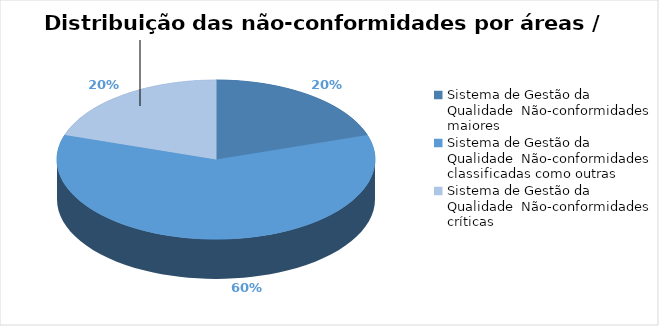
| Category | Total |
|---|---|
| 0 | 1 |
| 1 | 3 |
| 2 | 1 |